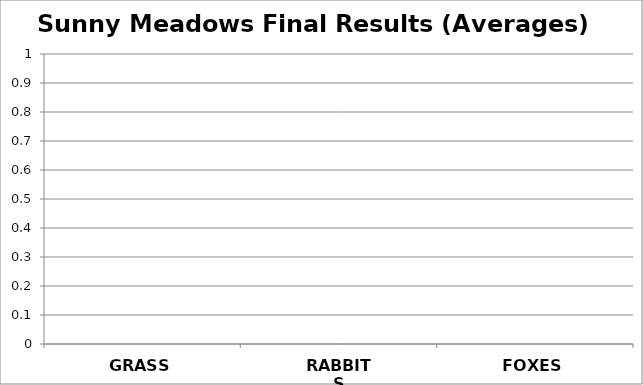
| Category | Series 0 |
|---|---|
| GRASS | 0 |
| RABBITS | 0 |
| FOXES | 0 |